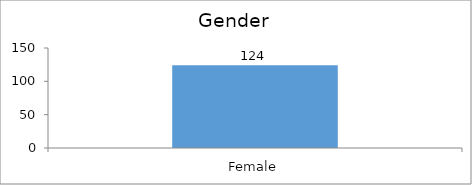
| Category | Gender |
|---|---|
| Female | 124 |